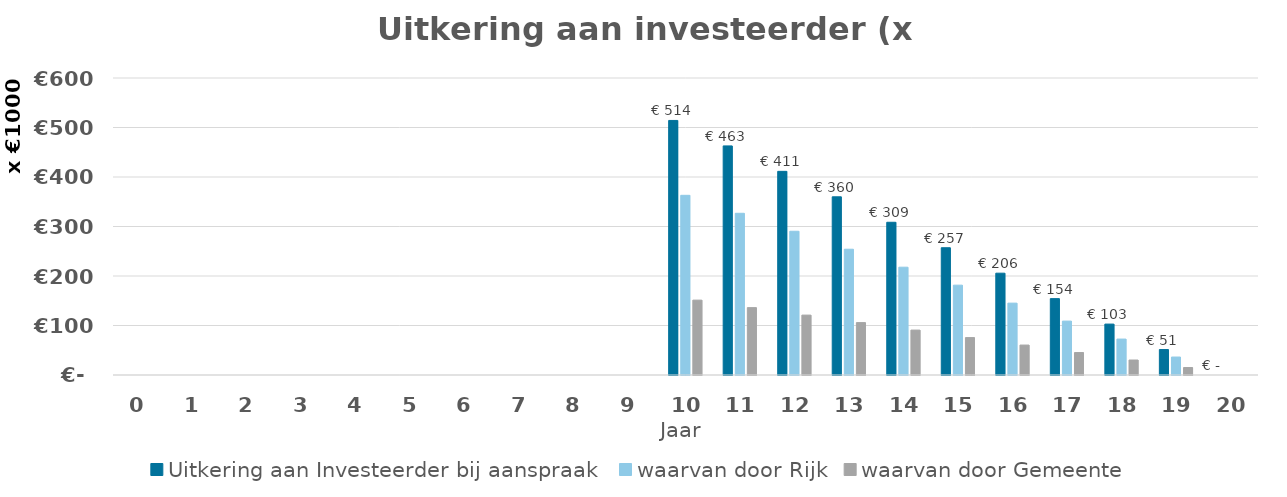
| Category | Uitkering aan Investeerder bij aanspraak | waarvan door Rijk | waarvan door Gemeente |
|---|---|---|---|
| 0.0 | 0 | 0 | 0 |
| 1.0 | 0 | 0 | 0 |
| 2.0 | 0 | 0 | 0 |
| 3.0 | 0 | 0 | 0 |
| 4.0 | 0 | 0 | 0 |
| 5.0 | 0 | 0 | 0 |
| 6.0 | 0 | 0 | 0 |
| 7.0 | 0 | 0 | 0 |
| 8.0 | 0 | 0 | 0 |
| 9.0 | 0 | 0 | 0 |
| 10.0 | 514249.15 | 362999.4 | 151249.75 |
| 11.0 | 462824.15 | 326699.4 | 136124.75 |
| 12.0 | 411399.15 | 290399.4 | 120999.75 |
| 13.0 | 359974.15 | 254099.4 | 105874.75 |
| 14.0 | 308549.15 | 217799.4 | 90749.75 |
| 15.0 | 257124.15 | 181499.4 | 75624.75 |
| 16.0 | 205699.15 | 145199.4 | 60499.75 |
| 17.0 | 154274.15 | 108899.4 | 45374.75 |
| 18.0 | 102849.15 | 72599.4 | 30249.75 |
| 19.0 | 51424.15 | 36299.4 | 15124.75 |
| 20.0 | 0 | 0 | 0 |